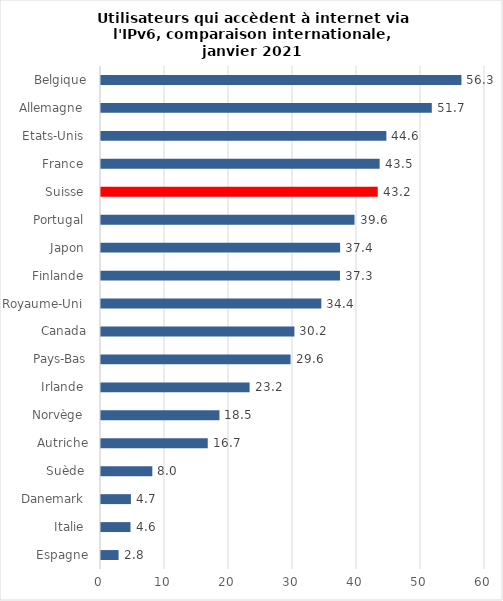
| Category | Series 0 |
|---|---|
| Espagne | 2.75 |
| Italie  | 4.61 |
| Danemark  | 4.67 |
| Suède  | 8.02 |
| Autriche | 16.68 |
| Norvège  | 18.51 |
| Irlande  | 23.22 |
| Pays-Bas | 29.62 |
| Canada | 30.22 |
| Royaume-Uni  | 34.43 |
| Finlande  | 37.34 |
| Japon  | 37.36 |
| Portugal  | 39.61 |
| Suisse  | 43.24 |
| France  | 43.54 |
| Etats-Unis  | 44.59 |
| Allemagne  | 51.69 |
| Belgique | 56.32 |